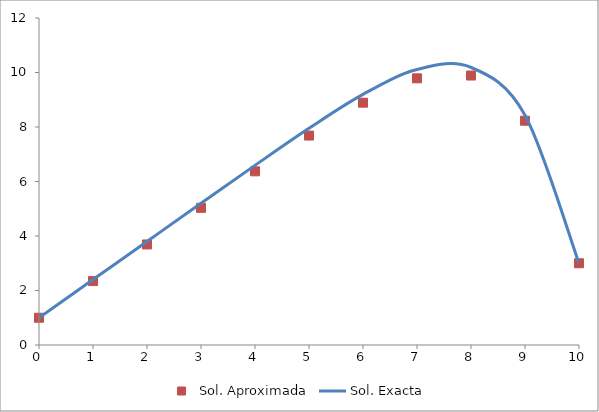
| Category | Sol. Aproximada |
|---|---|
| 0.0 | 1 |
| 1.0 | 2.345 |
| 2.0 | 3.69 |
| 3.0 | 5.034 |
| 4.0 | 6.374 |
| 5.0 | 7.686 |
| 6.0 | 8.893 |
| 7.0 | 9.786 |
| 8.0 | 9.889 |
| 9.0 | 8.23 |
| 10.0 | 3 |